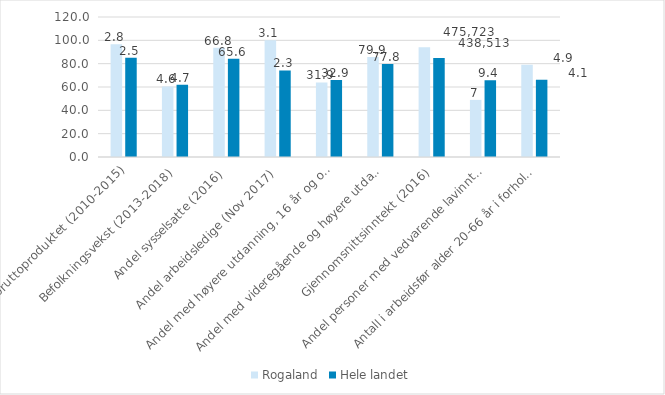
| Category | Rogaland | Hele landet |
|---|---|---|
| Endring i bruttoproduktet (2010-2015) | 96.659 | 85.077 |
| Befolkningsvekst (2013-2018) | 60.526 | 61.842 |
| Andel sysselsatte (2016) | 93.651 | 84.127 |
| Andel arbeidsledige (Nov 2017) | 100 | 74.194 |
| Andel med høyere utdanning, 16 år og over (2016) | 63.928 | 65.932 |
| Andel med videregående og høyere utdanning, 25-29 år (2016) | 85.673 | 79.656 |
| Gjennomsnittsinntekt (2016) | 94.119 | 84.798 |
| Andel personer med vedvarende lavinntekt (2014-16) | 48.951 | 65.734 |
| Antall i arbeidsfør alder 20-66 år i forhold til eldre 67 år og over (2018) | 79.032 | 66.129 |